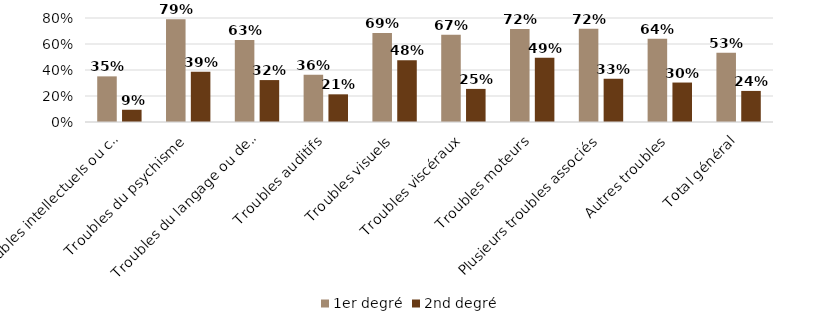
| Category | 1er degré | 2nd degré |
|---|---|---|
| Troubles intellectuels ou cognitifs | 0.351 | 0.094 |
| Troubles du psychisme | 0.791 | 0.387 |
| Troubles du langage ou de la parole | 0.63 | 0.322 |
| Troubles auditifs | 0.363 | 0.213 |
| Troubles visuels | 0.685 | 0.476 |
| Troubles viscéraux | 0.672 | 0.255 |
| Troubles moteurs | 0.716 | 0.495 |
| Plusieurs troubles associés | 0.718 | 0.332 |
| Autres troubles | 0.64 | 0.304 |
| Total général | 0.533 | 0.239 |